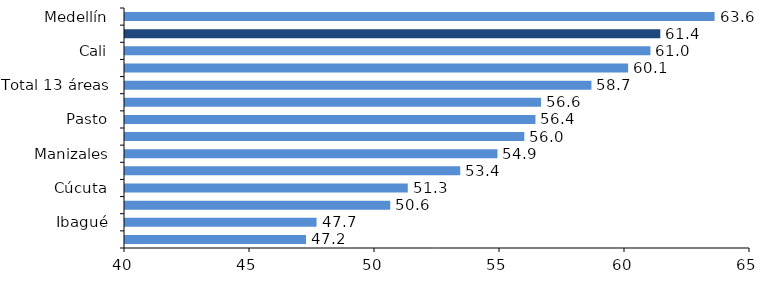
| Category | Series 0 |
|---|---|
| Medellín | 63.584 |
| Bogotá | 61.412 |
| Cali | 61.017 |
| Bucaramanga | 60.126 |
| Total 13 áreas | 58.657 |
| Villavicencio | 56.643 |
| Pasto | 56.419 |
| Pereira | 55.972 |
| Manizales | 54.899 |
| Montería | 53.409 |
| Cúcuta | 51.311 |
| Barranquilla | 50.609 |
| Ibagué | 47.663 |
| Cartagena | 47.239 |